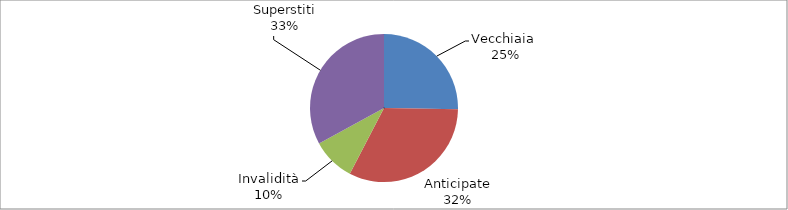
| Category | Series 0 |
|---|---|
| Vecchiaia  | 95209 |
| Anticipate | 121962 |
| Invalidità | 35459 |
| Superstiti | 124123 |